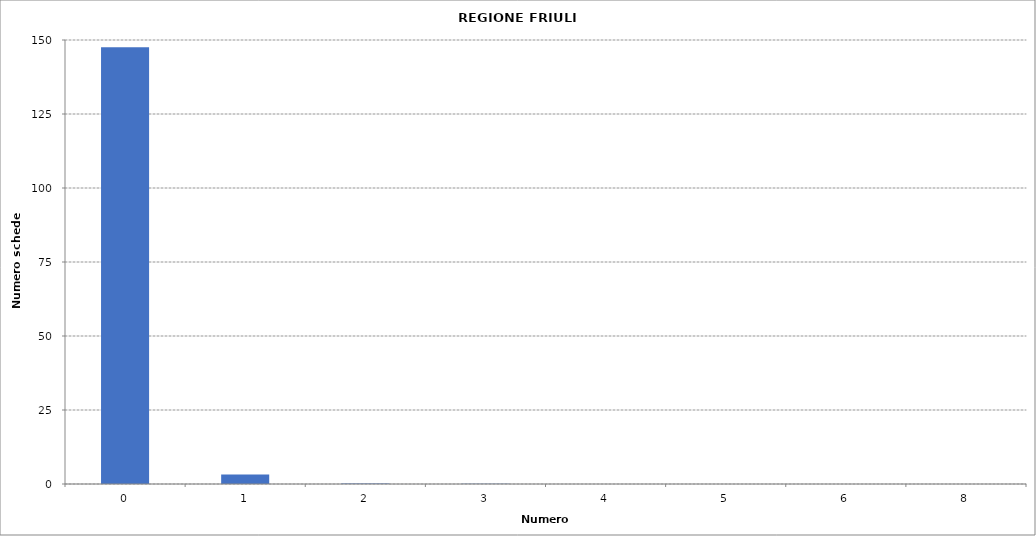
| Category | Series 0 |
|---|---|
| 0.0 | 147591 |
| 1.0 | 3242 |
| 2.0 | 194 |
| 3.0 | 64 |
| 4.0 | 32 |
| 5.0 | 14 |
| 6.0 | 1 |
| 8.0 | 1 |